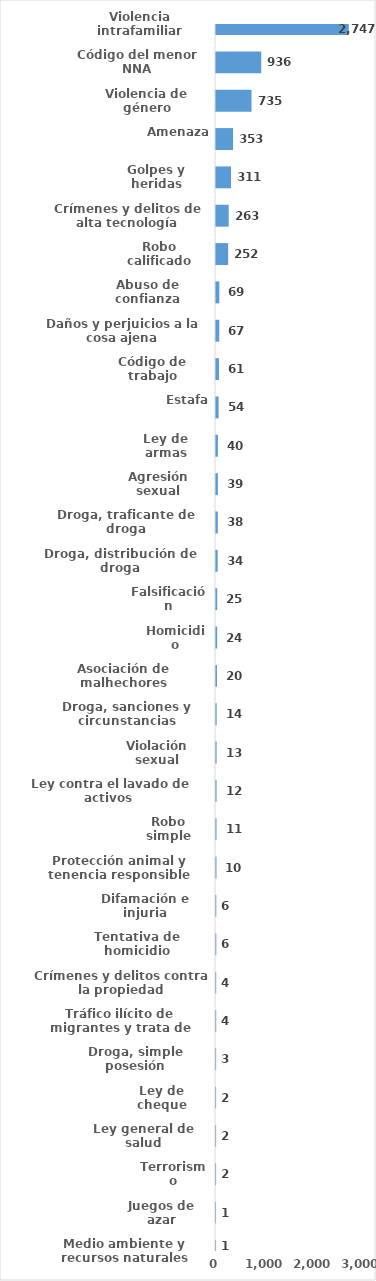
| Category | Series 0 |
|---|---|
| Violencia intrafamiliar | 2747 |
| Código del menor NNA | 936 |
| Violencia de género | 735 |
| Amenaza | 353 |
| Golpes y heridas | 311 |
| Crímenes y delitos de alta tecnología | 263 |
| Robo calificado | 252 |
| Abuso de confianza | 69 |
| Daños y perjuicios a la cosa ajena | 67 |
| Código de trabajo | 61 |
| Estafa | 54 |
| Ley de armas | 40 |
| Agresión sexual | 39 |
| Droga, traficante de droga | 38 |
| Droga, distribución de droga | 34 |
| Falsificación | 25 |
| Homicidio | 24 |
| Asociación de malhechores | 20 |
| Droga, sanciones y circunstancias agravantes | 14 |
| Violación sexual | 13 |
| Ley contra el lavado de activos  | 12 |
| Robo simple | 11 |
| Protección animal y tenencia responsible | 10 |
| Difamación e injuria | 6 |
| Tentativa de homicidio | 6 |
| Crímenes y delitos contra la propiedad | 4 |
| Tráfico ilícito de migrantes y trata de personas | 4 |
| Droga, simple posesión | 3 |
| Ley de cheque | 2 |
| Ley general de salud | 2 |
| Terrorismo | 2 |
| Juegos de azar | 1 |
| Medio ambiente y recursos naturales | 1 |